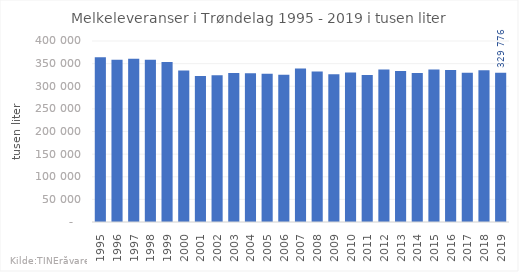
| Category | Totalt |
|---|---|
| 1995 | 364342 |
| 1996 | 358747 |
| 1997 | 360610.373 |
| 1998 | 358627.215 |
| 1999 | 353316.698 |
| 2000 | 334719.892 |
| 2001 | 322854.116 |
| 2002 | 324411.517 |
| 2003 | 329277.251 |
| 2004 | 328610 |
| 2005 | 327393 |
| 2006 | 325257 |
| 2007 | 339336 |
| 2008 | 332730 |
| 2009 | 326259 |
| 2010 | 330538.114 |
| 2011 | 324909.769 |
| 2012 | 336984.765 |
| 2013 | 333564.3 |
| 2014 | 329127.417 |
| 2015 | 336882.969 |
| 2016 | 335940.568 |
| 2017 | 330072.391 |
| 2018 | 335319.122 |
| 2019 | 329776.211 |